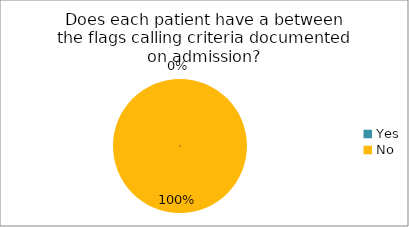
| Category | Does each patient have a between the flags calling criteria documented on admission? |
|---|---|
| Yes | 0 |
| No | 1 |